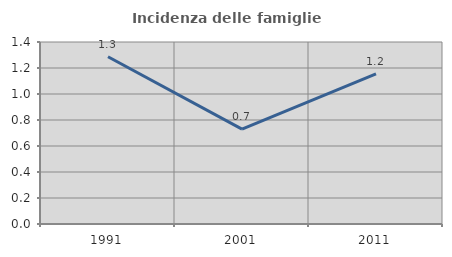
| Category | Incidenza delle famiglie numerose |
|---|---|
| 1991.0 | 1.286 |
| 2001.0 | 0.73 |
| 2011.0 | 1.154 |